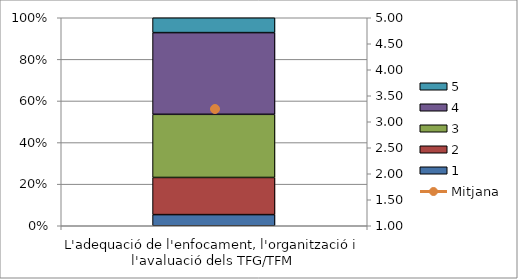
| Category | 1 | 2 | 3 | 4 | 5 |
|---|---|---|---|---|---|
| L'adequació de l'enfocament, l'organització i l'avaluació dels TFG/TFM | 3 | 10 | 17 | 22 | 4 |